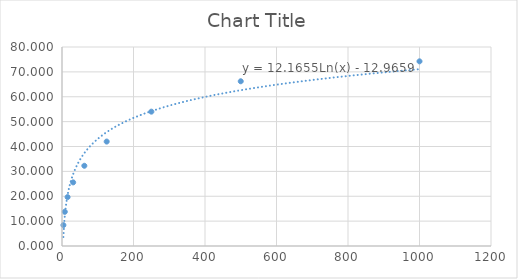
| Category | Series 0 |
|---|---|
| 3.91 | 8.397 |
| 7.81 | 13.74 |
| 15.62 | 19.656 |
| 31.25 | 25.573 |
| 62.5 | 32.252 |
| 125.0 | 41.985 |
| 250.0 | 54.008 |
| 500.0 | 66.221 |
| 1000.0 | 74.237 |